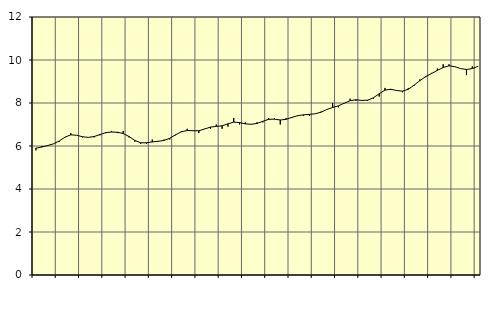
| Category | Piggar | Offentlig förvaltning m.m., SNI 84, 99 |
|---|---|---|
| nan | 5.8 | 5.9 |
| 1.0 | 6 | 5.95 |
| 1.0 | 6 | 6.02 |
| 1.0 | 6.1 | 6.1 |
| nan | 6.2 | 6.23 |
| 2.0 | 6.4 | 6.41 |
| 2.0 | 6.6 | 6.52 |
| 2.0 | 6.5 | 6.5 |
| nan | 6.4 | 6.43 |
| 3.0 | 6.4 | 6.4 |
| 3.0 | 6.4 | 6.44 |
| 3.0 | 6.5 | 6.53 |
| nan | 6.6 | 6.62 |
| 4.0 | 6.7 | 6.65 |
| 4.0 | 6.6 | 6.64 |
| 4.0 | 6.7 | 6.58 |
| nan | 6.4 | 6.44 |
| 5.0 | 6.2 | 6.26 |
| 5.0 | 6.1 | 6.15 |
| 5.0 | 6.1 | 6.15 |
| nan | 6.3 | 6.19 |
| 6.0 | 6.2 | 6.22 |
| 6.0 | 6.3 | 6.26 |
| 6.0 | 6.3 | 6.36 |
| nan | 6.5 | 6.52 |
| 7.0 | 6.7 | 6.66 |
| 7.0 | 6.8 | 6.72 |
| 7.0 | 6.7 | 6.71 |
| nan | 6.6 | 6.71 |
| 8.0 | 6.8 | 6.79 |
| 8.0 | 6.8 | 6.88 |
| 8.0 | 7 | 6.91 |
| nan | 6.8 | 6.94 |
| 9.0 | 6.9 | 7.03 |
| 9.0 | 7.3 | 7.11 |
| 9.0 | 7 | 7.09 |
| nan | 7.1 | 7.03 |
| 10.0 | 7 | 7.01 |
| 10.0 | 7.1 | 7.05 |
| 10.0 | 7.1 | 7.15 |
| nan | 7.3 | 7.24 |
| 11.0 | 7.3 | 7.25 |
| 11.0 | 7 | 7.21 |
| 11.0 | 7.3 | 7.24 |
| nan | 7.3 | 7.33 |
| 12.0 | 7.4 | 7.41 |
| 12.0 | 7.4 | 7.45 |
| 12.0 | 7.4 | 7.47 |
| nan | 7.5 | 7.5 |
| 13.0 | 7.6 | 7.57 |
| 13.0 | 7.7 | 7.7 |
| 13.0 | 8 | 7.79 |
| nan | 7.8 | 7.87 |
| 14.0 | 8 | 7.99 |
| 14.0 | 8.2 | 8.11 |
| 14.0 | 8.1 | 8.15 |
| nan | 8.1 | 8.12 |
| 15.0 | 8.1 | 8.13 |
| 15.0 | 8.2 | 8.24 |
| 15.0 | 8.3 | 8.43 |
| nan | 8.7 | 8.6 |
| 16.0 | 8.6 | 8.64 |
| 16.0 | 8.6 | 8.58 |
| 16.0 | 8.5 | 8.55 |
| nan | 8.7 | 8.64 |
| 17.0 | 8.8 | 8.83 |
| 17.0 | 9.1 | 9.04 |
| 17.0 | 9.2 | 9.23 |
| nan | 9.4 | 9.37 |
| 18.0 | 9.6 | 9.52 |
| 18.0 | 9.8 | 9.65 |
| 18.0 | 9.8 | 9.73 |
| nan | 9.7 | 9.69 |
| 19.0 | 9.6 | 9.6 |
| 19.0 | 9.3 | 9.56 |
| 19.0 | 9.7 | 9.6 |
| nan | 9.7 | 9.71 |